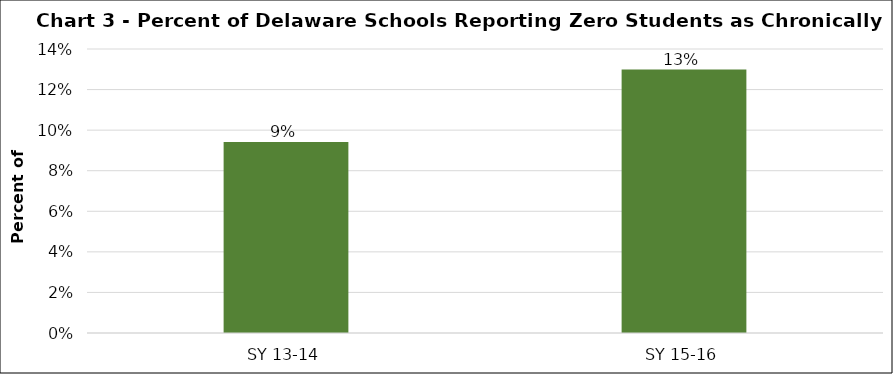
| Category | Series 0 |
|---|---|
| SY 13-14 | 0.094 |
| SY 15-16 | 0.13 |